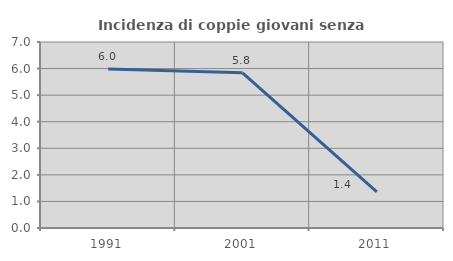
| Category | Incidenza di coppie giovani senza figli |
|---|---|
| 1991.0 | 5.983 |
| 2001.0 | 5.839 |
| 2011.0 | 1.361 |